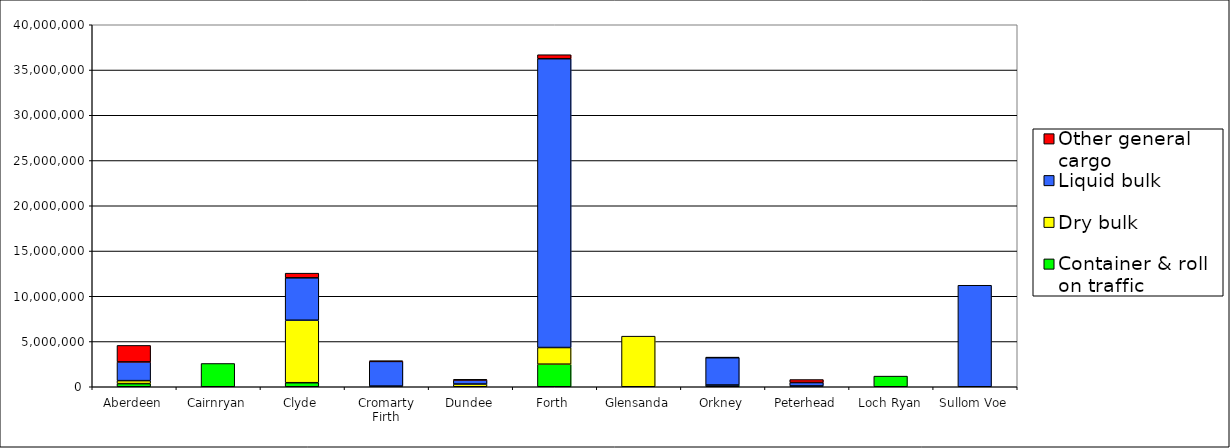
| Category | Container & roll on traffic | Dry bulk | Liquid bulk | Other general cargo |
|---|---|---|---|---|
| Aberdeen | 345168 | 330706 | 2065366 | 1828821 |
| Cairnryan | 2571913 | 0 | 0 | 0 |
| Clyde | 446748 | 6904211 | 4685485 | 515680 |
| Cromarty Firth | 0 | 73490 | 2726958 | 63591 |
| Dundee | 0 | 299559 | 450942 | 59441 |
| Forth | 2494191 | 1840497 | 31913166 | 442331 |
| Glensanda | 0 | 5590653 | 0 | 0 |
| Orkney | 181740 | 12410 | 3026438 | 20906 |
| Peterhead | 0 | 88298 | 377249 | 331033 |
| Loch Ryan | 1176987 | 0 | 0 | 0 |
| Sullom Voe | 0 | 0 | 11216595 | 0 |